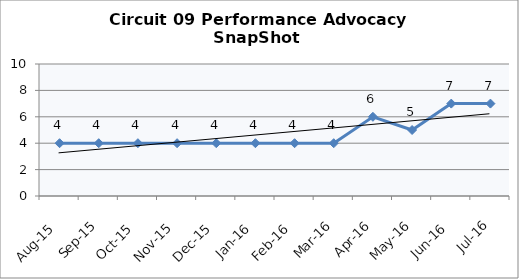
| Category | Circuit 09 |
|---|---|
| Aug-15 | 4 |
| Sep-15 | 4 |
| Oct-15 | 4 |
| Nov-15 | 4 |
| Dec-15 | 4 |
| Jan-16 | 4 |
| Feb-16 | 4 |
| Mar-16 | 4 |
| Apr-16 | 6 |
| May-16 | 5 |
| Jun-16 | 7 |
| Jul-16 | 7 |